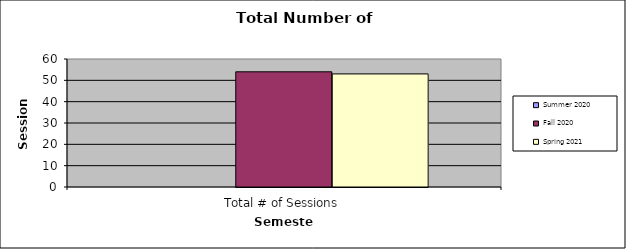
| Category | Summer 2020 | Fall 2020 | Spring 2021 |
|---|---|---|---|
| Total # of Sessions | 0 | 54 | 53 |